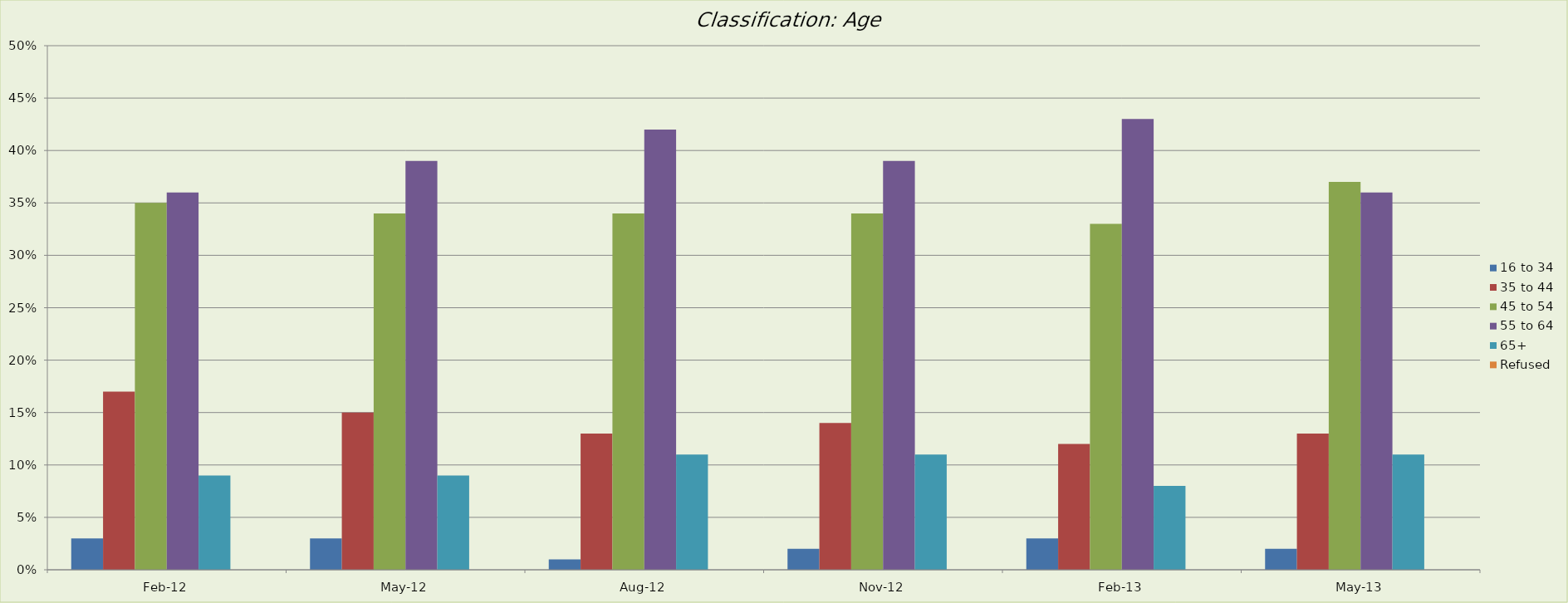
| Category | 16 to 34 | 35 to 44 | 45 to 54 | 55 to 64 | 65+ | Refused |
|---|---|---|---|---|---|---|
| 2012-02-01 | 0.03 | 0.17 | 0.35 | 0.36 | 0.09 | 0 |
| 2012-05-01 | 0.03 | 0.15 | 0.34 | 0.39 | 0.09 | 0 |
| 2012-08-01 | 0.01 | 0.13 | 0.34 | 0.42 | 0.11 | 0 |
| 2012-11-01 | 0.02 | 0.14 | 0.34 | 0.39 | 0.11 | 0 |
| 2013-02-01 | 0.03 | 0.12 | 0.33 | 0.43 | 0.08 | 0 |
| 2013-05-01 | 0.02 | 0.13 | 0.37 | 0.36 | 0.11 | 0 |